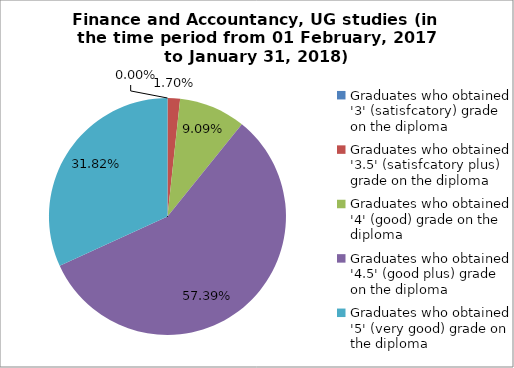
| Category | Series 0 |
|---|---|
| Graduates who obtained '3' (satisfcatory) grade on the diploma | 0 |
| Graduates who obtained '3.5' (satisfcatory plus) grade on the diploma | 1.705 |
| Graduates who obtained '4' (good) grade on the diploma | 9.091 |
| Graduates who obtained '4.5' (good plus) grade on the diploma | 57.386 |
| Graduates who obtained '5' (very good) grade on the diploma | 31.818 |